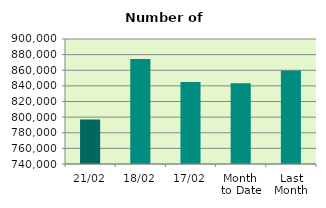
| Category | Series 0 |
|---|---|
| 21/02 | 796910 |
| 18/02 | 874276 |
| 17/02 | 844806 |
| Month 
to Date | 843325.067 |
| Last
Month | 859790.952 |